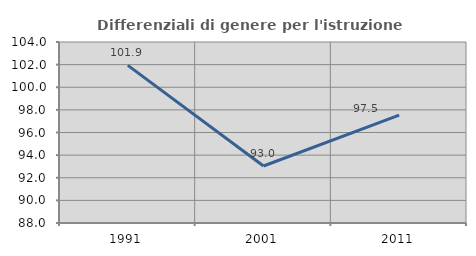
| Category | Differenziali di genere per l'istruzione superiore |
|---|---|
| 1991.0 | 101.937 |
| 2001.0 | 93.039 |
| 2011.0 | 97.542 |